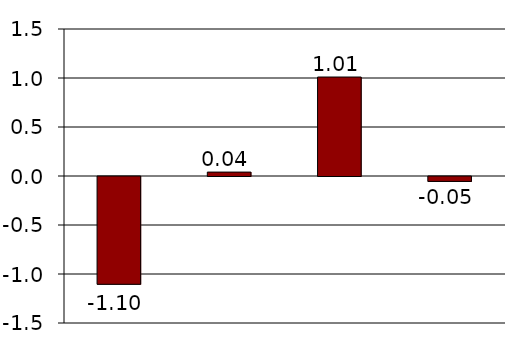
| Category | Series 0 |
|---|---|
| Employer contribution | -1.1 |
| EITC | 0.04 |
| Taxation of benefits | 1.01 |
| Net effect | -0.05 |